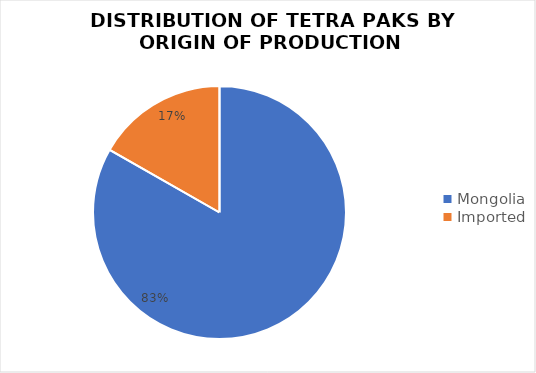
| Category | Series 0 |
|---|---|
| Mongolia | 726 |
| Imported | 146 |